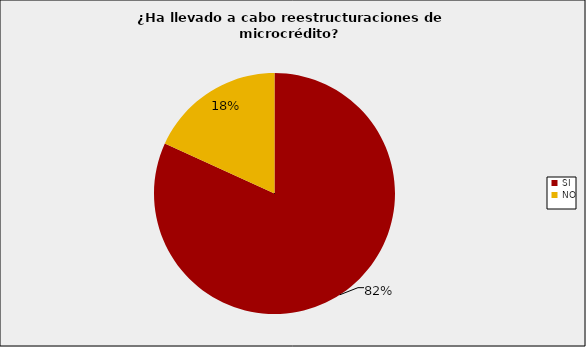
| Category | Entidades Supervisadas SFC |
|---|---|
| SI | 0.818 |
| NO | 0.182 |